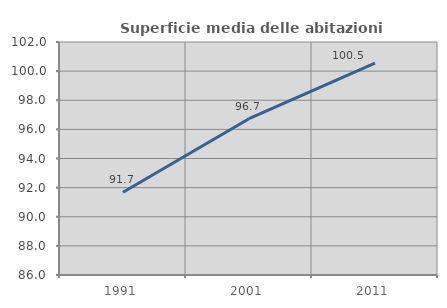
| Category | Superficie media delle abitazioni occupate |
|---|---|
| 1991.0 | 91.68 |
| 2001.0 | 96.731 |
| 2011.0 | 100.548 |